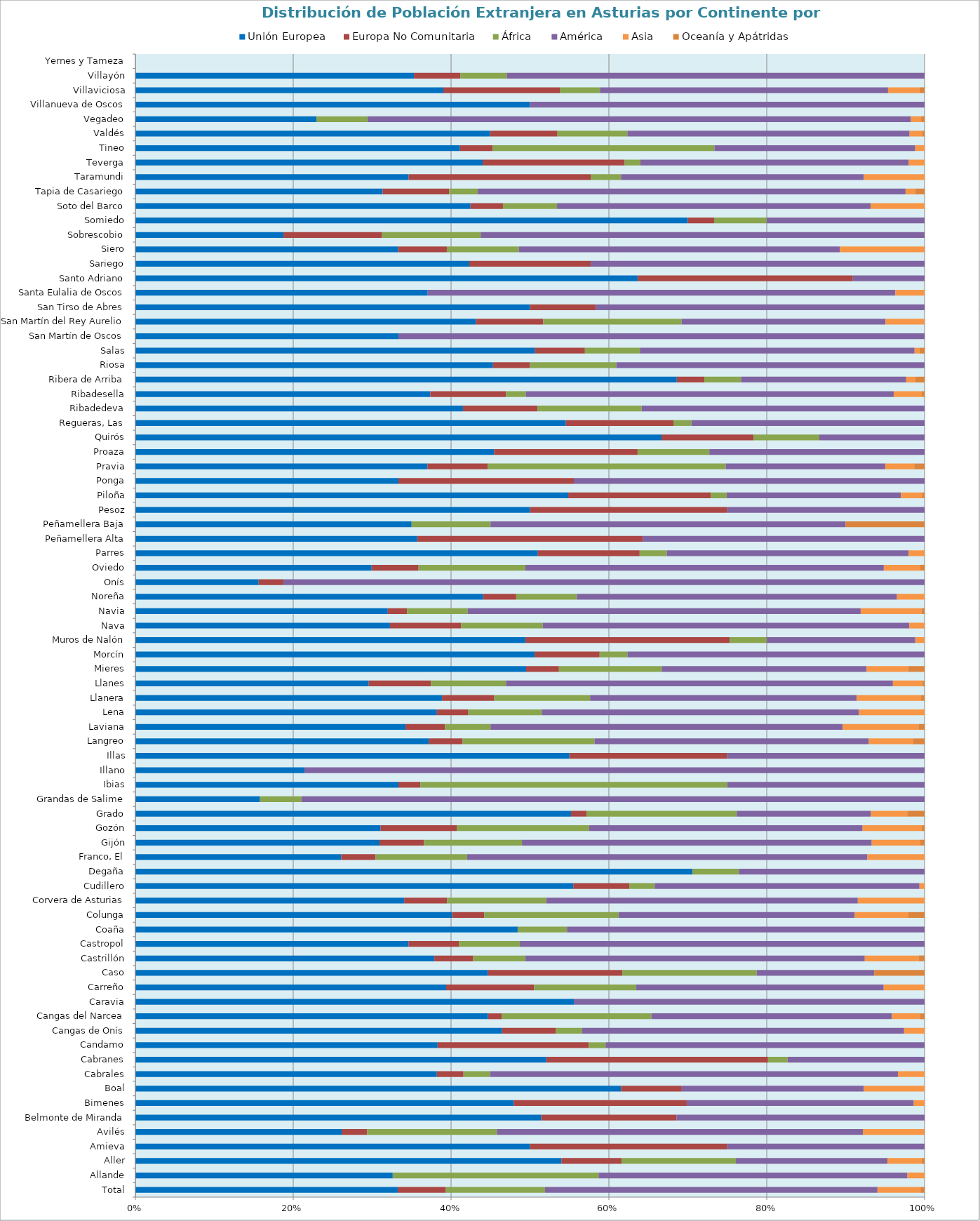
| Category | Unión Europea | Europa No Comunitaria | África | América | Asia | Oceanía y Apátridas |
|---|---|---|---|---|---|---|
| Total | 16151 | 2959 | 6113 | 20464 | 2650 | 252 |
| Allande | 15 | 0 | 12 | 18 | 1 | 0 |
| Aller | 149 | 21 | 40 | 53 | 12 | 1 |
| Amieva | 12 | 6 | 0 | 6 | 0 | 0 |
| Avilés | 849 | 105 | 534 | 1506 | 252 | 2 |
| Belmonte de Miranda | 18 | 6 | 0 | 11 | 0 | 0 |
| Bimenes | 35 | 16 | 0 | 21 | 1 | 0 |
| Boal | 8 | 1 | 0 | 3 | 1 | 0 |
| Cabrales | 34 | 3 | 3 | 46 | 3 | 0 |
| Cabranes | 63 | 34 | 3 | 21 | 0 | 0 |
| Candamo | 18 | 9 | 1 | 19 | 0 | 0 |
| Cangas de Onís | 197 | 29 | 14 | 173 | 11 | 0 |
| Cangas del Narcea | 151 | 6 | 64 | 103 | 12 | 2 |
| Caravia | 5 | 0 | 0 | 4 | 0 | 0 |
| Carreño | 152 | 43 | 50 | 121 | 20 | 0 |
| Caso | 21 | 8 | 8 | 7 | 0 | 3 |
| Castrillón | 200 | 26 | 35 | 227 | 36 | 4 |
| Castropol | 27 | 5 | 6 | 40 | 0 | 0 |
| Coaña | 31 | 0 | 4 | 29 | 0 | 0 |
| Colunga | 59 | 6 | 25 | 44 | 10 | 3 |
| Corvera de Asturias | 157 | 25 | 58 | 182 | 39 | 0 |
| Cudillero | 86 | 11 | 5 | 52 | 1 | 0 |
| Degaña | 12 | 0 | 1 | 4 | 0 | 0 |
| Franco, El | 18 | 3 | 8 | 35 | 5 | 0 |
| Gijón | 4775 | 871 | 1917 | 6842 | 951 | 83 |
| Gozón | 87 | 27 | 47 | 97 | 21 | 1 |
| Grado | 276 | 10 | 95 | 85 | 23 | 11 |
| Grandas de Salime | 3 | 0 | 1 | 15 | 0 | 0 |
| Ibias | 12 | 1 | 14 | 9 | 0 | 0 |
| Illano | 3 | 0 | 0 | 11 | 0 | 0 |
| Illas | 11 | 4 | 0 | 5 | 0 | 0 |
| Langreo | 416 | 48 | 187 | 389 | 63 | 16 |
| Laviana | 89 | 13 | 15 | 116 | 25 | 2 |
| Lena | 115 | 12 | 28 | 121 | 25 | 0 |
| Llanera | 176 | 30 | 55 | 153 | 37 | 2 |
| Llanes | 199 | 53 | 64 | 330 | 25 | 2 |
| Mieres | 452 | 38 | 119 | 237 | 48 | 19 |
| Morcín | 43 | 7 | 3 | 32 | 0 | 0 |
| Muros de Nalón | 42 | 22 | 4 | 16 | 1 | 0 |
| Nava | 50 | 14 | 16 | 72 | 3 | 0 |
| Navia | 79 | 6 | 19 | 123 | 19 | 1 |
| Noreña | 63 | 6 | 11 | 58 | 5 | 0 |
| Onís | 5 | 1 | 0 | 26 | 0 | 0 |
| Oviedo | 4509 | 896 | 2040 | 6840 | 698 | 80 |
| Parres | 178 | 45 | 12 | 107 | 7 | 0 |
| Peñamellera Alta | 5 | 4 | 0 | 5 | 0 | 0 |
| Peñamellera Baja | 7 | 0 | 2 | 9 | 0 | 2 |
| Pesoz | 2 | 1 | 0 | 1 | 0 | 0 |
| Piloña | 164 | 54 | 6 | 66 | 8 | 1 |
| Ponga | 3 | 2 | 0 | 4 | 0 | 0 |
| Pravia | 141 | 29 | 115 | 77 | 14 | 5 |
| Proaza | 5 | 2 | 1 | 3 | 0 | 0 |
| Quirós | 40 | 7 | 5 | 8 | 0 | 0 |
| Regueras, Las | 24 | 6 | 1 | 13 | 0 | 0 |
| Ribadedeva | 22 | 5 | 7 | 19 | 0 | 0 |
| Ribadesella | 105 | 27 | 7 | 131 | 10 | 1 |
| Ribera de Arriba | 59 | 3 | 4 | 18 | 1 | 1 |
| Riosa | 29 | 3 | 7 | 25 | 0 | 0 |
| Salas | 80 | 10 | 11 | 55 | 1 | 1 |
| San Martín de Oscos | 1 | 0 | 0 | 2 | 0 | 0 |
| San Martín del Rey Aurelio | 192 | 38 | 78 | 115 | 22 | 0 |
| San Tirso de Abres | 6 | 1 | 0 | 5 | 0 | 0 |
| Santa Eulalia de Oscos | 10 | 0 | 0 | 16 | 1 | 0 |
| Santo Adriano | 14 | 6 | 0 | 2 | 0 | 0 |
| Sariego | 11 | 4 | 0 | 11 | 0 | 0 |
| Siero | 583 | 108 | 160 | 712 | 187 | 1 |
| Sobrescobio | 3 | 2 | 2 | 9 | 0 | 0 |
| Somiedo | 21 | 1 | 2 | 6 | 0 | 0 |
| Soto del Barco | 31 | 3 | 5 | 29 | 5 | 0 |
| Tapia de Casariego | 26 | 7 | 3 | 45 | 1 | 1 |
| Taramundi | 9 | 6 | 1 | 8 | 2 | 0 |
| Teverga | 22 | 9 | 1 | 17 | 1 | 0 |
| Tineo | 139 | 14 | 95 | 86 | 4 | 0 |
| Valdés | 142 | 27 | 28 | 113 | 5 | 1 |
| Vegadeo | 53 | 0 | 15 | 159 | 3 | 1 |
| Villanueva de Oscos | 1 | 0 | 0 | 1 | 0 | 0 |
| Villaviciosa | 295 | 112 | 38 | 276 | 30 | 5 |
| Villayón | 6 | 1 | 1 | 9 | 0 | 0 |
| Yernes y Tameza | 0 | 0 | 0 | 0 | 0 | 0 |